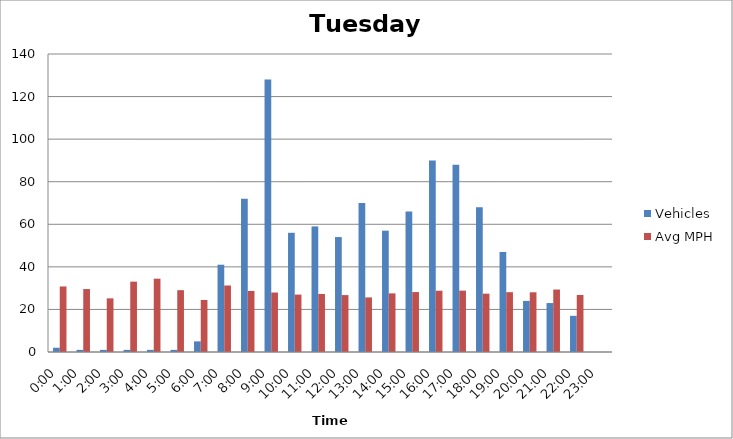
| Category | Vehicles | Avg MPH |
|---|---|---|
| 0:00 | 2 | 30.79 |
| 1:00 | 1 | 29.57 |
| 2:00 | 1 | 25.21 |
| 3:00 | 1 | 33.05 |
| 4:00 | 1 | 34.44 |
| 5:00 | 1 | 29.05 |
| 6:00 | 5 | 24.45 |
| 7:00 | 41 | 31.24 |
| 8:00 | 72 | 28.69 |
| 9:00 | 128 | 27.94 |
| 10:00 | 56 | 26.97 |
| 11:00 | 59 | 27.27 |
| 12:00 | 54 | 26.74 |
| 13:00 | 70 | 25.64 |
| 14:00 | 57 | 27.54 |
| 15:00 | 66 | 28.16 |
| 16:00 | 90 | 28.79 |
| 17:00 | 88 | 28.83 |
| 18:00 | 68 | 27.4 |
| 19:00 | 47 | 28.1 |
| 20:00 | 24 | 28.05 |
| 21:00 | 23 | 29.35 |
| 22:00 | 17 | 26.79 |
| 23:00 | 0 | 0 |